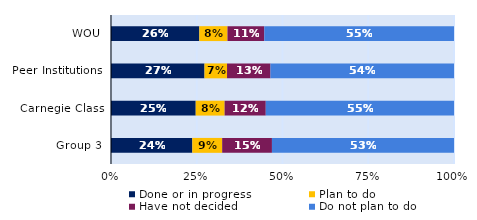
| Category | Done or in progress | Plan to do | Have not decided | Do not plan to do |
|---|---|---|---|---|
| WOU | 0.258 | 0.082 | 0.107 | 0.553 |
| Peer Institutions | 0.273 | 0.066 | 0.127 | 0.535 |
| Carnegie Class | 0.247 | 0.084 | 0.12 | 0.549 |
| Group 3 | 0.237 | 0.087 | 0.145 | 0.531 |